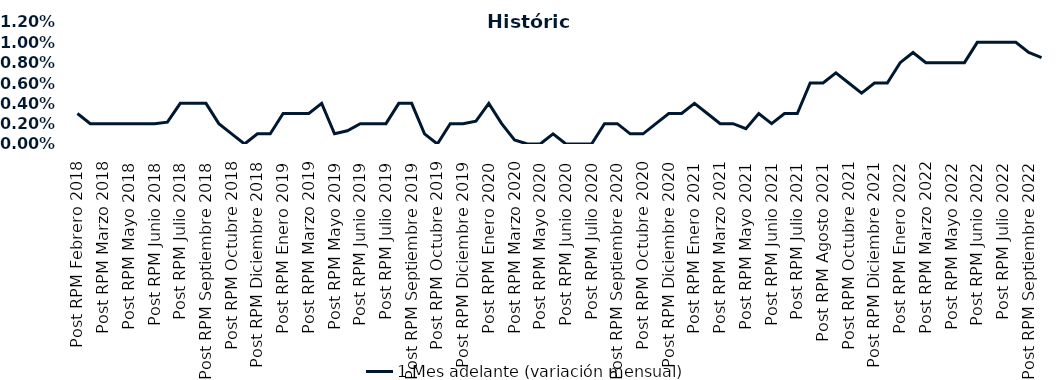
| Category | 1 Mes adelante (variación mensual) |
|---|---|
| Post RPM Febrero 2018 | 0.003 |
| Pre RPM Marzo 2018 | 0.002 |
| Post RPM Marzo 2018 | 0.002 |
| Pre RPM Mayo 2018 | 0.002 |
| Post RPM Mayo 2018 | 0.002 |
| Pre RPM Junio 2018 | 0.002 |
| Post RPM Junio 2018 | 0.002 |
| Pre RPM Julio 2018 | 0.002 |
| Post RPM Julio 2018 | 0.004 |
| Pre RPM Septiembre 2018 | 0.004 |
| Post RPM Septiembre 2018 | 0.004 |
| Pre RPM Octubre 2018 | 0.002 |
| Post RPM Octubre 2018 | 0.001 |
| Pre RPM Diciembre 2018 | 0 |
| Post RPM Diciembre 2018 | 0.001 |
| Pre RPM Enero 2019 | 0.001 |
| Post RPM Enero 2019 | 0.003 |
| Pre RPM Marzo 2019 | 0.003 |
| Post RPM Marzo 2019 | 0.003 |
| Pre RPM Mayo 2019 | 0.004 |
| Post RPM Mayo 2019 | 0.001 |
| Pre RPM Junio 2019 | 0.001 |
| Post RPM Junio 2019 | 0.002 |
| Pre RPM Julio 2019 | 0.002 |
| Post RPM Julio 2019 | 0.002 |
| Pre RPM Septiembre 2019 | 0.004 |
| Post RPM Septiembre 2019 | 0.004 |
| Pre RPM Octubre 2019 | 0.001 |
| Post RPM Octubre 2019 | 0 |
| Pre RPM Diciembre 2019 | 0.002 |
| Post RPM Diciembre 2019 | 0.002 |
| Pre RPM Enero 2020 | 0.002 |
| Post RPM Enero 2020 | 0.004 |
| Pre RPM Marzo 2020 | 0.002 |
| Post RPM Marzo 2020 | 0 |
| Pre RPM Mayo 2020 | 0 |
| Post RPM Mayo 2020 | 0 |
| Pre RPM Junio 2020 | 0.001 |
| Post RPM Junio 2020 | 0 |
| Pre RPM Julio 2020 | 0 |
| Post RPM Julio 2020 | 0 |
| Pre RPM Septiembre 2020 | 0.002 |
| Post RPM Septiembre 2020 | 0.002 |
| Pre RPM Octubre 2020 | 0.001 |
| Post RPM Octubre 2020 | 0.001 |
| Pre RPM Diciembre 2020 | 0.002 |
| Post RPM Diciembre 2020 | 0.003 |
| Pre RPM Enero 2021 | 0.003 |
| Post RPM Enero 2021 | 0.004 |
| Pre RPM Marzo 2021 | 0.003 |
| Post RPM Marzo 2021 | 0.002 |
| Pre RPM Mayo 2021 | 0.002 |
| Post RPM Mayo 2021 | 0.002 |
| Pre RPM Junio 2021 | 0.003 |
| Post RPM Junio 2021 | 0.002 |
| Pre RPM Julio 2021 | 0.003 |
| Post RPM Julio 2021 | 0.003 |
| Pre RPM Agosto 2021 | 0.006 |
| Post RPM Agosto 2021 | 0.006 |
| Pre RPM Octubre 2021 | 0.007 |
| Post RPM Octubre 2021 | 0.006 |
| Pre RPM Diciembre 2021 | 0.005 |
| Post RPM Diciembre 2021 | 0.006 |
| Pre RPM Enero 2022 | 0.006 |
| Post RPM Enero 2022 | 0.008 |
| Pre RPM Marzo 2022 | 0.009 |
| Post RPM Marzo 2022 | 0.008 |
| Pre RPM Mayo 2022 | 0.008 |
| Post RPM Mayo 2022 | 0.008 |
| Pre RPM Junio 2022 | 0.008 |
| Post RPM Junio 2022 | 0.01 |
| Pre RPM Julio 2022 | 0.01 |
| Post RPM Julio 2022 | 0.01 |
| Pre RPM Septiembre 2022 | 0.01 |
| Post RPM Septiembre 2022 | 0.009 |
| Pre RPM Octubre 2022 | 0.008 |